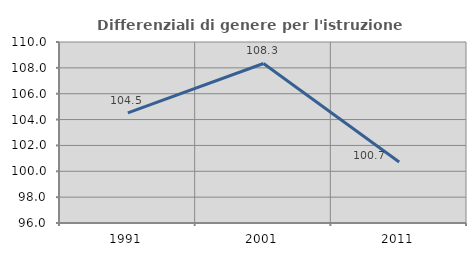
| Category | Differenziali di genere per l'istruzione superiore |
|---|---|
| 1991.0 | 104.513 |
| 2001.0 | 108.339 |
| 2011.0 | 100.718 |